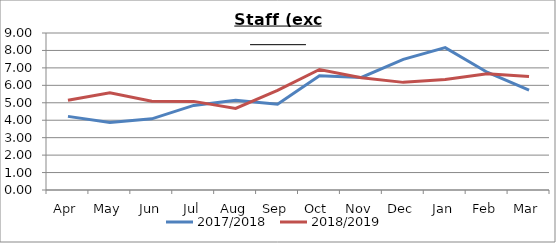
| Category | 2017/2018 | 2018/2019 |
|---|---|---|
| Apr | 4.22 | 5.14 |
| May | 3.87 | 5.57 |
| Jun | 4.08 | 5.09 |
| Jul | 4.85 | 5.08 |
| Aug | 5.14 | 4.68 |
| Sep | 4.92 | 5.71 |
| Oct | 6.55 | 6.91 |
| Nov | 6.45 | 6.43 |
| Dec | 7.49 | 6.17 |
| Jan | 8.16 | 6.33 |
| Feb | 6.75 | 6.67 |
| Mar | 5.73 | 6.5 |